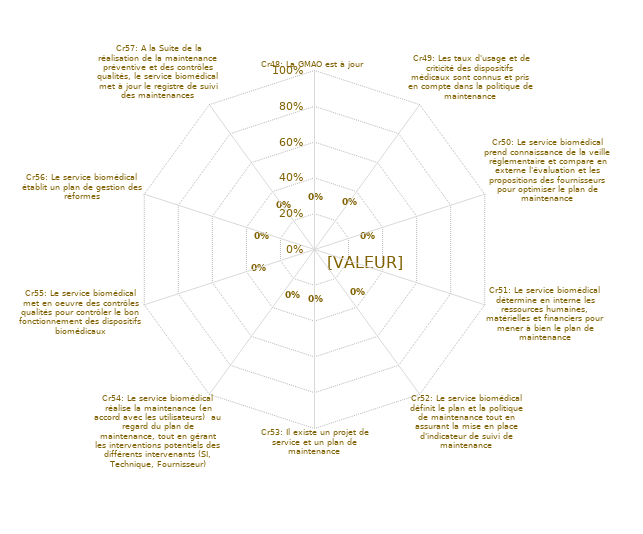
| Category | Graphes RADAR pour Résultats Globaux BPM  |
|---|---|
| Cr48: La GMAO est à jour | 0 |
| Cr49: Les taux d'usage et de criticité des dispositifs médicaux sont connus et pris en compte dans la politique de maintenance | 0 |
| Cr50: Le service biomédical prend connaissance de la veille réglementaire et compare en externe l'évaluation et les propositions des fournisseurs pour optimiser le plan de maintenance | 0 |
| Cr51: Le service biomédical détermine en interne les ressources humaines, matérielles et financiers pour mener à bien le plan de maintenance | 0 |
| Cr52: Le service biomédical définit le plan et la politique de maintenance tout en assurant la mise en place d'indicateur de suivi de maintenance | 0 |
| Cr53: Il existe un projet de service et un plan de maintenance | 0 |
| Cr54: Le service biomédical réalise la maintenance (en accord avec les utilisateurs)  au regard du plan de maintenance, tout en gérant les interventions potentiels des différents intervenants (SI, Technique, Fournisseur) | 0 |
| Cr55: Le service biomédical met en oeuvre des contrôles qualités pour contrôler le bon fonctionnement des dispositifs biomédicaux | 0 |
| Cr56: Le service biomédical établit un plan de gestion des réformes | 0 |
| Cr57: A la Suite de la réalisation de la maintenance préventive et des contrôles qualités, le service biomédical met à jour le registre de suivi des maintenances | 0 |